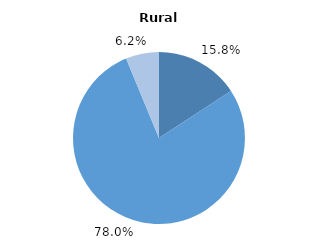
| Category | Series 0 |
|---|---|
| 0 | 15.777 |
| 1 | 77.978 |
| 2 | 6.245 |